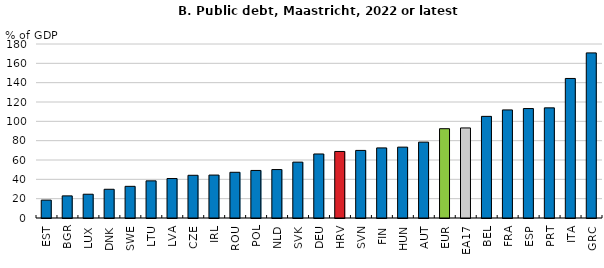
| Category | 2022 or latest |
|---|---|
| EST | 18.498 |
| BGR | 22.885 |
| LUX | 24.594 |
| DNK | 29.721 |
| SWE | 32.757 |
| LTU | 38.437 |
| LVA | 40.825 |
| CZE | 44.177 |
| IRL | 44.416 |
| ROU | 47.284 |
| POL | 49.194 |
| NLD | 50.121 |
| SVK | 57.8 |
| DEU | 66.226 |
| HRV | 68.837 |
| SVN | 69.919 |
| FIN | 72.496 |
| HUN | 73.312 |
| AUT | 78.482 |
| EUR | 92.39 |
| EA17 | 93.166 |
| BEL | 105.129 |
| FRA | 111.817 |
| ESP | 113.219 |
| PRT | 113.938 |
| ITA | 144.346 |
| GRC | 170.793 |